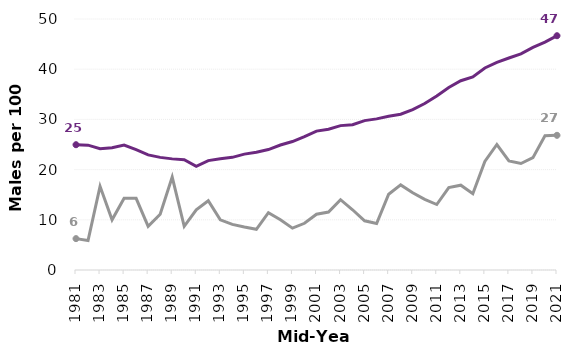
| Category | 90-99 | 100+ |
|---|---|---|
| 1981.0 | 24.954 | 6.25 |
| 1982.0 | 24.863 | 5.882 |
| 1983.0 | 24.147 | 16.667 |
| 1984.0 | 24.338 | 10 |
| 1985.0 | 24.896 | 14.286 |
| 1986.0 | 23.961 | 14.286 |
| 1987.0 | 22.929 | 8.696 |
| 1988.0 | 22.434 | 11.111 |
| 1989.0 | 22.136 | 18.519 |
| 1990.0 | 21.976 | 8.696 |
| 1991.0 | 20.645 | 12 |
| 1992.0 | 21.79 | 13.793 |
| 1993.0 | 22.16 | 10 |
| 1994.0 | 22.44 | 9.091 |
| 1995.0 | 23.081 | 8.571 |
| 1996.0 | 23.467 | 8.108 |
| 1997.0 | 23.996 | 11.429 |
| 1998.0 | 24.892 | 10 |
| 1999.0 | 25.591 | 8.333 |
| 2000.0 | 26.577 | 9.302 |
| 2001.0 | 27.672 | 11.111 |
| 2002.0 | 28.054 | 11.538 |
| 2003.0 | 28.762 | 14 |
| 2004.0 | 28.932 | 12 |
| 2005.0 | 29.758 | 9.804 |
| 2006.0 | 30.106 | 9.259 |
| 2007.0 | 30.635 | 15.094 |
| 2008.0 | 31.025 | 16.949 |
| 2009.0 | 31.956 | 15.385 |
| 2010.0 | 33.169 | 14.062 |
| 2011.0 | 34.648 | 13.043 |
| 2012.0 | 36.364 | 16.418 |
| 2013.0 | 37.706 | 16.901 |
| 2014.0 | 38.467 | 15.19 |
| 2015.0 | 40.254 | 21.622 |
| 2016.0 | 41.377 | 25 |
| 2017.0 | 42.229 | 21.739 |
| 2018.0 | 43.057 | 21.212 |
| 2019.0 | 44.331 | 22.388 |
| 2020.0 | 45.397 | 26.761 |
| 2021.0 | 46.667 | 26.829 |